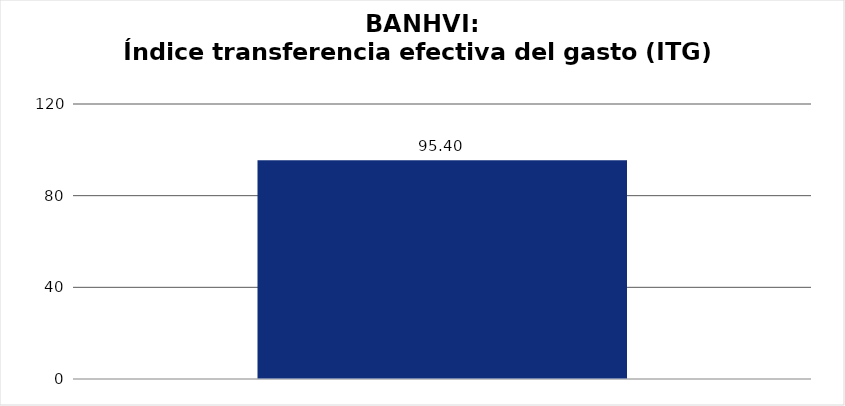
| Category | Índice transferencia efectiva del gasto (ITG) |
|---|---|
|  | 95.403 |